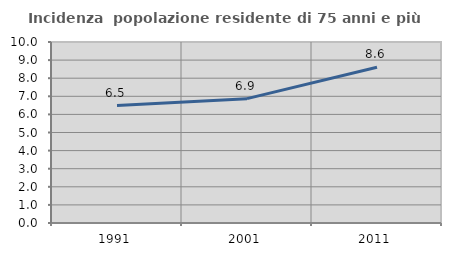
| Category | Incidenza  popolazione residente di 75 anni e più |
|---|---|
| 1991.0 | 6.491 |
| 2001.0 | 6.869 |
| 2011.0 | 8.604 |